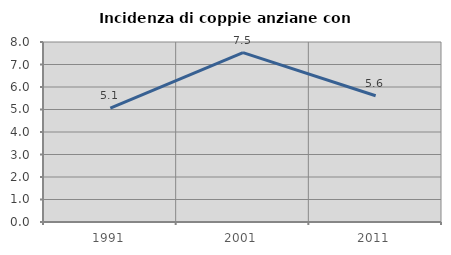
| Category | Incidenza di coppie anziane con figli |
|---|---|
| 1991.0 | 5.063 |
| 2001.0 | 7.527 |
| 2011.0 | 5.612 |